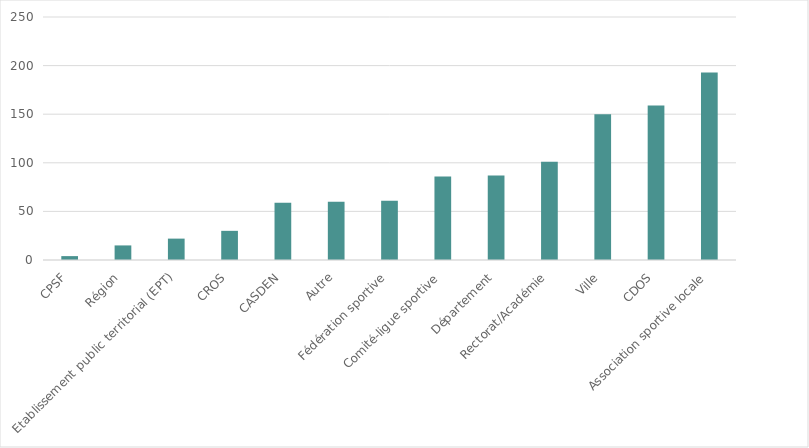
| Category | Series 0 |
|---|---|
| CPSF | 4 |
| Région | 15 |
| Etablissement public territorial (EPT) | 22 |
| CROS | 30 |
| CASDEN | 59 |
| Autre | 60 |
| Fédération sportive | 61 |
| Comité-ligue sportive | 86 |
| Département | 87 |
| Rectorat/Académie | 101 |
| Ville | 150 |
| CDOS | 159 |
| Association sportive locale | 193 |